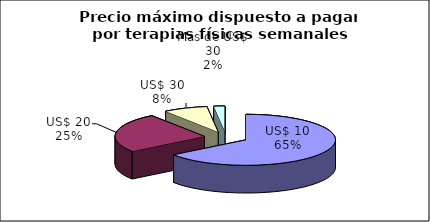
| Category | Series 0 |
|---|---|
| US$ 10 | 0.65 |
| US$ 20 | 0.25 |
| US$ 30 | 0.08 |
| Más de US$ 30 | 0.02 |